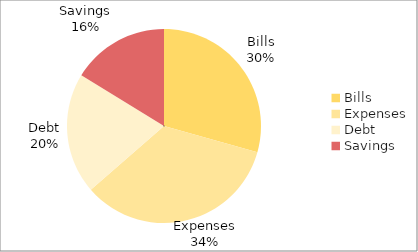
| Category | Overview |
|---|---|
| Bills | 1500 |
| Expenses | 1750 |
| Debt | 1030 |
| Savings | 830 |